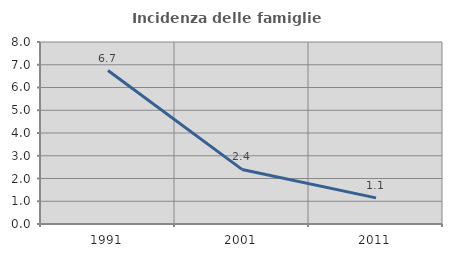
| Category | Incidenza delle famiglie numerose |
|---|---|
| 1991.0 | 6.745 |
| 2001.0 | 2.399 |
| 2011.0 | 1.149 |